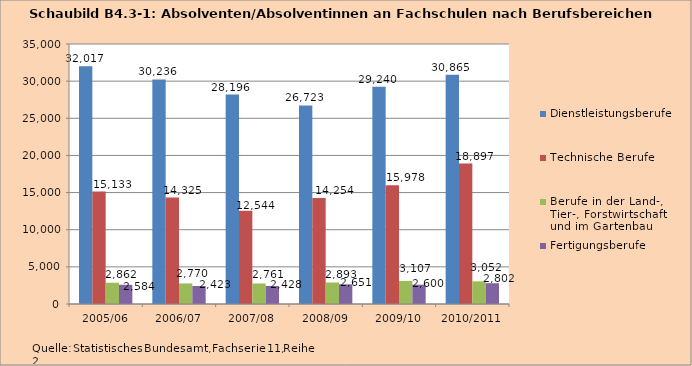
| Category | Dienstleistungsberufe | Technische Berufe | Berufe in der Land-, Tier-, Forstwirtschaft und im Gartenbau | Fertigungsberufe |
|---|---|---|---|---|
| 2005/06 | 32017 | 15133 | 2862 | 2584 |
| 2006/07 | 30236 | 14325 | 2770 | 2423 |
| 2007/08 | 28196 | 12544 | 2761 | 2428 |
| 2008/09 | 26723 | 14254 | 2893 | 2651 |
| 2009/10 | 29240 | 15978 | 3107 | 2600 |
| 2010/2011 | 30865 | 18897 | 3052 | 2802 |